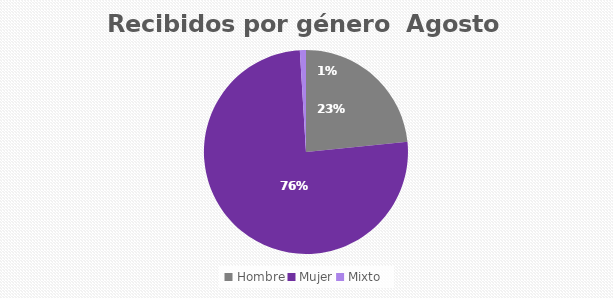
| Category | Recibidos por género  AGOSTO |
|---|---|
| Hombre | 145 |
| Mujer | 469 |
| Mixto | 6 |